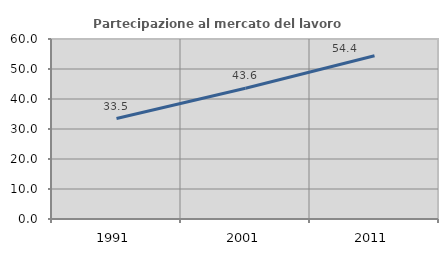
| Category | Partecipazione al mercato del lavoro  femminile |
|---|---|
| 1991.0 | 33.491 |
| 2001.0 | 43.608 |
| 2011.0 | 54.402 |